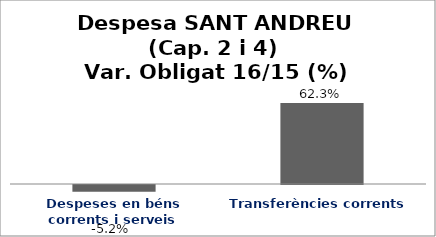
| Category | Series 0 |
|---|---|
| Despeses en béns corrents i serveis | -0.052 |
| Transferències corrents | 0.623 |